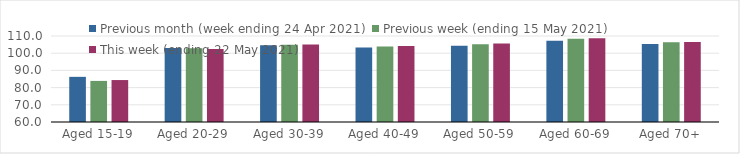
| Category | Previous month (week ending 24 Apr 2021) | Previous week (ending 15 May 2021) | This week (ending 22 May 2021) |
|---|---|---|---|
| Aged 15-19 | 86.25 | 83.89 | 84.39 |
| Aged 20-29 | 102.96 | 102.87 | 102.47 |
| Aged 30-39 | 104.63 | 104.98 | 105.12 |
| Aged 40-49 | 103.3 | 103.91 | 104.25 |
| Aged 50-59 | 104.32 | 105.2 | 105.7 |
| Aged 60-69 | 107.26 | 108.4 | 108.66 |
| Aged 70+ | 105.38 | 106.36 | 106.56 |